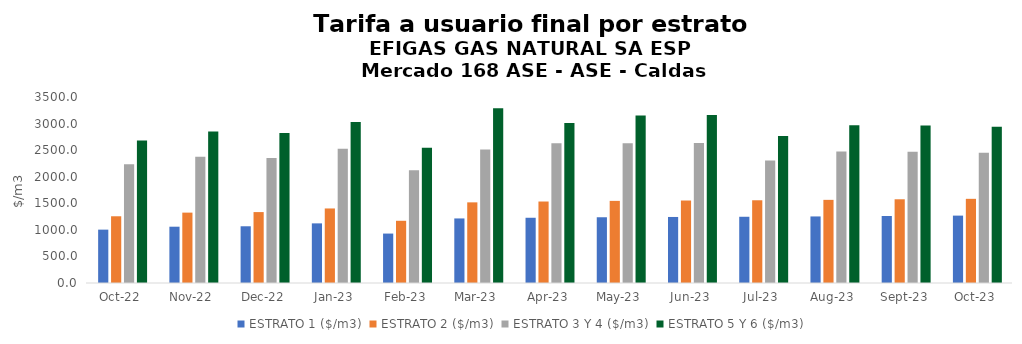
| Category | ESTRATO 1 ($/m3) | ESTRATO 2 ($/m3) | ESTRATO 3 Y 4 ($/m3) | ESTRATO 5 Y 6 ($/m3) |
|---|---|---|---|---|
| 2022-10-01 | 1004.17 | 1255.69 | 2233.24 | 2679.888 |
| 2022-11-01 | 1059.41 | 1324.26 | 2374.06 | 2848.872 |
| 2022-12-01 | 1067.55 | 1334.45 | 2351.81 | 2822.172 |
| 2023-01-01 | 1122.06 | 1402.59 | 2525 | 3030 |
| 2023-02-01 | 930.14 | 1170.78 | 2119.87 | 2543.844 |
| 2023-03-01 | 1214.8 | 1517.42 | 2509.997 | 3287.928 |
| 2023-04-01 | 1227.57 | 1533.36 | 2628.313 | 3011.997 |
| 2023-05-01 | 1237.16 | 1545.35 | 2628.313 | 3153.975 |
| 2023-06-01 | 1242.57 | 1552.1 | 2634.476 | 3161.371 |
| 2023-07-01 | 1246.29 | 1556.75 | 2305.861 | 2767.033 |
| 2023-08-01 | 1252.53 | 1564.55 | 2473.749 | 2968.499 |
| 2023-09-01 | 1261.29 | 1575.49 | 2470.388 | 2964.465 |
| 2023-10-01 | 1268 | 1583.87 | 2451.642 | 2941.971 |